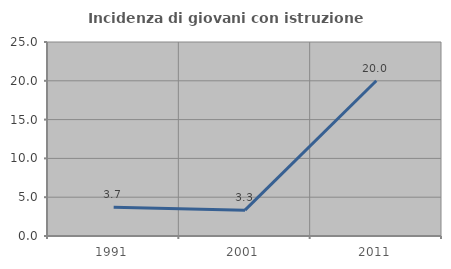
| Category | Incidenza di giovani con istruzione universitaria |
|---|---|
| 1991.0 | 3.704 |
| 2001.0 | 3.333 |
| 2011.0 | 20 |